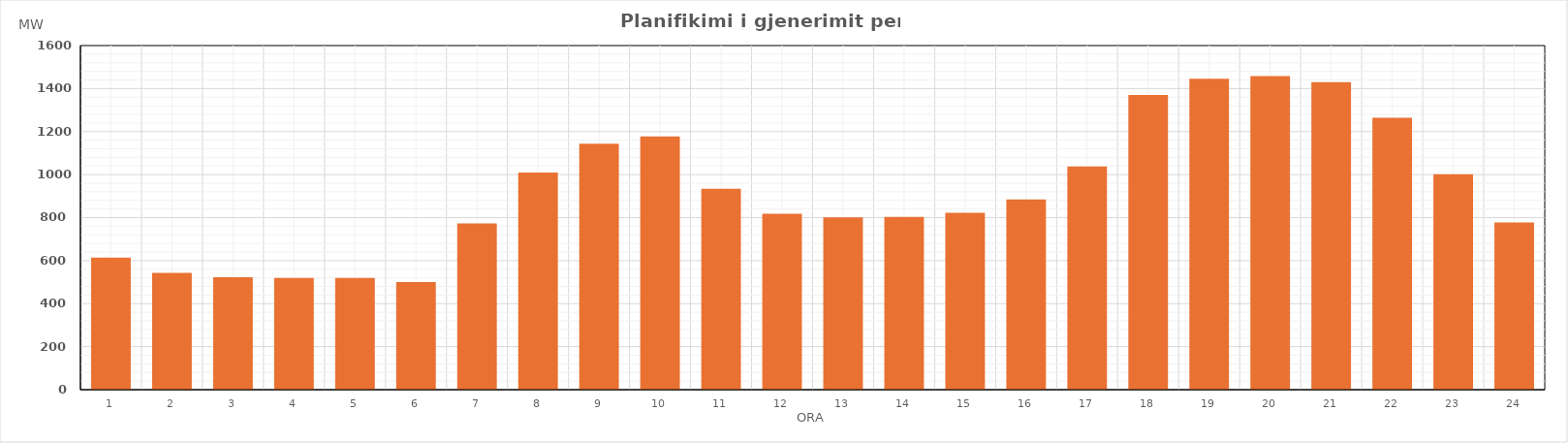
| Category | Max (MW) |
|---|---|
| 0 | 614.17 |
| 1 | 542.76 |
| 2 | 523.28 |
| 3 | 518.97 |
| 4 | 519.66 |
| 5 | 499.82 |
| 6 | 773.36 |
| 7 | 1009.11 |
| 8 | 1143.39 |
| 9 | 1177.19 |
| 10 | 934.23 |
| 11 | 817.48 |
| 12 | 801.2 |
| 13 | 803.9 |
| 14 | 822.18 |
| 15 | 884.92 |
| 16 | 1038.09 |
| 17 | 1370.46 |
| 18 | 1445.18 |
| 19 | 1457.47 |
| 20 | 1430.04 |
| 21 | 1263.97 |
| 22 | 1001.52 |
| 23 | 777.29 |